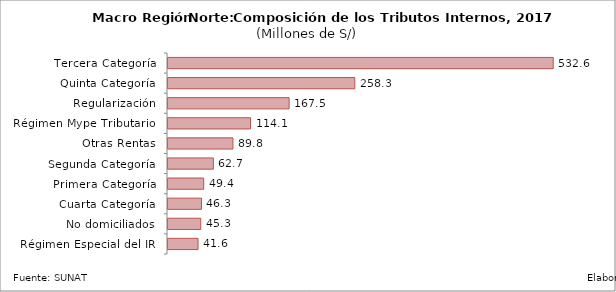
| Category | Series 0 | Series 1 | Series 2 |
|---|---|---|---|
|    Tercera Categoría |  |  | 532.565 |
|    Quinta Categoría |  |  | 258.293 |
|    Regularización |  |  | 167.488 |
|    Régimen Mype Tributario |  |  | 114.074 |
|    Otras Rentas |  |  | 89.816 |
|    Segunda Categoría |  |  | 62.722 |
|    Primera Categoría |  |  | 49.38 |
|    Cuarta Categoría |  |  | 46.296 |
|    No domiciliados |  |  | 45.282 |
|    Régimen Especial del IR |  |  | 41.554 |